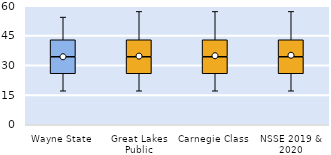
| Category | 25th | 50th | 75th |
|---|---|---|---|
| Wayne State | 25.714 | 8.571 | 8.571 |
| Great Lakes Public | 25.714 | 8.571 | 8.571 |
| Carnegie Class | 25.714 | 8.571 | 8.571 |
| NSSE 2019 & 2020 | 25.714 | 8.571 | 8.571 |